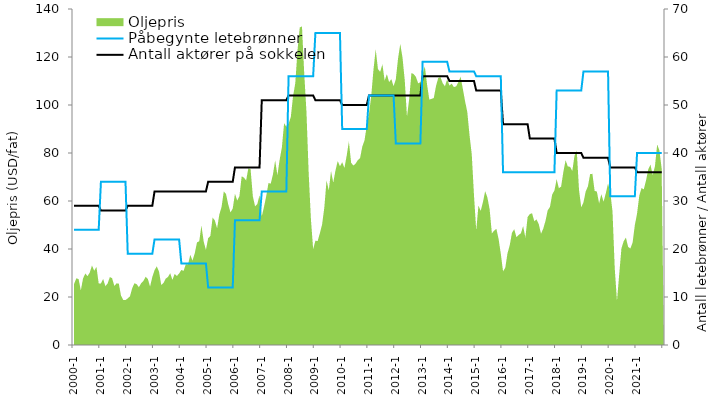
| Category | Antall aktører på sokkelen | Påbegynte letebrønner |
|---|---|---|
| 2000-1 | 29 | 24 |
| 2000-2 | 29 | 24 |
| 2000-3 | 29 | 24 |
| 2000-4 | 29 | 24 |
| 2000-5 | 29 | 24 |
| 2000-6 | 29 | 24 |
| 2000-7 | 29 | 24 |
| 2000-8 | 29 | 24 |
| 2000-9 | 29 | 24 |
| 2000-10 | 29 | 24 |
| 2000-11 | 29 | 24 |
| 2000-12 | 29 | 24 |
| 2001-1 | 28 | 34 |
| 2001-2 | 28 | 34 |
| 2001-3 | 28 | 34 |
| 2001-4 | 28 | 34 |
| 2001-5 | 28 | 34 |
| 2001-6 | 28 | 34 |
| 2001-7 | 28 | 34 |
| 2001-8 | 28 | 34 |
| 2001-9 | 28 | 34 |
| 2001-10 | 28 | 34 |
| 2001-11 | 28 | 34 |
| 2001-12 | 28 | 34 |
| 2002-1 | 29 | 19 |
| 2002-2 | 29 | 19 |
| 2002-3 | 29 | 19 |
| 2002-4 | 29 | 19 |
| 2002-5 | 29 | 19 |
| 2002-6 | 29 | 19 |
| 2002-7 | 29 | 19 |
| 2002-8 | 29 | 19 |
| 2002-9 | 29 | 19 |
| 2002-10 | 29 | 19 |
| 2002-11 | 29 | 19 |
| 2002-12 | 29 | 19 |
| 2003-1 | 32 | 22 |
| 2003-2 | 32 | 22 |
| 2003-3 | 32 | 22 |
| 2003-4 | 32 | 22 |
| 2003-5 | 32 | 22 |
| 2003-6 | 32 | 22 |
| 2003-7 | 32 | 22 |
| 2003-8 | 32 | 22 |
| 2003-9 | 32 | 22 |
| 2003-10 | 32 | 22 |
| 2003-11 | 32 | 22 |
| 2003-12 | 32 | 22 |
| 2004-1 | 32 | 17 |
| 2004-2 | 32 | 17 |
| 2004-3 | 32 | 17 |
| 2004-4 | 32 | 17 |
| 2004-5 | 32 | 17 |
| 2004-6 | 32 | 17 |
| 2004-7 | 32 | 17 |
| 2004-8 | 32 | 17 |
| 2004-9 | 32 | 17 |
| 2004-10 | 32 | 17 |
| 2004-11 | 32 | 17 |
| 2004-12 | 32 | 17 |
| 2005-1 | 34 | 12 |
| 2005-2 | 34 | 12 |
| 2005-3 | 34 | 12 |
| 2005-4 | 34 | 12 |
| 2005-5 | 34 | 12 |
| 2005-6 | 34 | 12 |
| 2005-7 | 34 | 12 |
| 2005-8 | 34 | 12 |
| 2005-9 | 34 | 12 |
| 2005-10 | 34 | 12 |
| 2005-11 | 34 | 12 |
| 2005-12 | 34 | 12 |
| 2006-1 | 37 | 26 |
| 2006-2 | 37 | 26 |
| 2006-3 | 37 | 26 |
| 2006-4 | 37 | 26 |
| 2006-5 | 37 | 26 |
| 2006-6 | 37 | 26 |
| 2006-7 | 37 | 26 |
| 2006-8 | 37 | 26 |
| 2006-9 | 37 | 26 |
| 2006-10 | 37 | 26 |
| 2006-11 | 37 | 26 |
| 2006-12 | 37 | 26 |
| 2007-1 | 51 | 32 |
| 2007-2 | 51 | 32 |
| 2007-3 | 51 | 32 |
| 2007-4 | 51 | 32 |
| 2007-5 | 51 | 32 |
| 2007-6 | 51 | 32 |
| 2007-7 | 51 | 32 |
| 2007-8 | 51 | 32 |
| 2007-9 | 51 | 32 |
| 2007-10 | 51 | 32 |
| 2007-11 | 51 | 32 |
| 2007-12 | 51 | 32 |
| 2008-1 | 52 | 56 |
| 2008-2 | 52 | 56 |
| 2008-3 | 52 | 56 |
| 2008-4 | 52 | 56 |
| 2008-5 | 52 | 56 |
| 2008-6 | 52 | 56 |
| 2008-7 | 52 | 56 |
| 2008-8 | 52 | 56 |
| 2008-9 | 52 | 56 |
| 2008-10 | 52 | 56 |
| 2008-11 | 52 | 56 |
| 2008-12 | 52 | 56 |
| 2009-1 | 51 | 65 |
| 2009-2 | 51 | 65 |
| 2009-3 | 51 | 65 |
| 2009-4 | 51 | 65 |
| 2009-5 | 51 | 65 |
| 2009-6 | 51 | 65 |
| 2009-7 | 51 | 65 |
| 2009-8 | 51 | 65 |
| 2009-9 | 51 | 65 |
| 2009-10 | 51 | 65 |
| 2009-11 | 51 | 65 |
| 2009-12 | 51 | 65 |
| 2010-1 | 50 | 45 |
| 2010-2 | 50 | 45 |
| 2010-3 | 50 | 45 |
| 2010-4 | 50 | 45 |
| 2010-5 | 50 | 45 |
| 2010-6 | 50 | 45 |
| 2010-7 | 50 | 45 |
| 2010-8 | 50 | 45 |
| 2010-9 | 50 | 45 |
| 2010-10 | 50 | 45 |
| 2010-11 | 50 | 45 |
| 2010-12 | 50 | 45 |
| 2011-1 | 52 | 52 |
| 2011-2 | 52 | 52 |
| 2011-3 | 52 | 52 |
| 2011-4 | 52 | 52 |
| 2011-5 | 52 | 52 |
| 2011-6 | 52 | 52 |
| 2011-7 | 52 | 52 |
| 2011-8 | 52 | 52 |
| 2011-9 | 52 | 52 |
| 2011-10 | 52 | 52 |
| 2011-11 | 52 | 52 |
| 2011-12 | 52 | 52 |
| 2012-1 | 52 | 42 |
| 2012-2 | 52 | 42 |
| 2012-3 | 52 | 42 |
| 2012-4 | 52 | 42 |
| 2012-5 | 52 | 42 |
| 2012-6 | 52 | 42 |
| 2012-7 | 52 | 42 |
| 2012-8 | 52 | 42 |
| 2012-9 | 52 | 42 |
| 2012-10 | 52 | 42 |
| 2012-11 | 52 | 42 |
| 2012-12 | 52 | 42 |
| 2013-1 | 56 | 59 |
| 2013-2 | 56 | 59 |
| 2013-3 | 56 | 59 |
| 2013-4 | 56 | 59 |
| 2013-5 | 56 | 59 |
| 2013-6 | 56 | 59 |
| 2013-7 | 56 | 59 |
| 2013-8 | 56 | 59 |
| 2013-9 | 56 | 59 |
| 2013-10 | 56 | 59 |
| 2013-11 | 56 | 59 |
| 2013-12 | 56 | 59 |
| 2014-1 | 55 | 57 |
| 2014-2 | 55 | 57 |
| 2014-3 | 55 | 57 |
| 2014-4 | 55 | 57 |
| 2014-5 | 55 | 57 |
| 2014-6 | 55 | 57 |
| 2014-7 | 55 | 57 |
| 2014-8 | 55 | 57 |
| 2014-9 | 55 | 57 |
| 2014-10 | 55 | 57 |
| 2014-11 | 55 | 57 |
| 2014-12 | 55 | 57 |
| 2015-1 | 53 | 56 |
| 2015-2 | 53 | 56 |
| 2015-3 | 53 | 56 |
| 2015-4 | 53 | 56 |
| 2015-5 | 53 | 56 |
| 2015-6 | 53 | 56 |
| 2015-7 | 53 | 56 |
| 2015-8 | 53 | 56 |
| 2015-9 | 53 | 56 |
| 2015-10 | 53 | 56 |
| 2015-11 | 53 | 56 |
| 2015-12 | 53 | 56 |
| 2016-1 | 46 | 36 |
| 2016-2 | 46 | 36 |
| 2016-3 | 46 | 36 |
| 2016-4 | 46 | 36 |
| 2016-5 | 46 | 36 |
| 2016-6 | 46 | 36 |
| 2016-7 | 46 | 36 |
| 2016-8 | 46 | 36 |
| 2016-9 | 46 | 36 |
| 2016-10 | 46 | 36 |
| 2016-11 | 46 | 36 |
| 2016-12 | 46 | 36 |
| 2017-1 | 43 | 36 |
| 2017-2 | 43 | 36 |
| 2017-3 | 43 | 36 |
| 2017-4 | 43 | 36 |
| 2017-5 | 43 | 36 |
| 2017-6 | 43 | 36 |
| 2017-7 | 43 | 36 |
| 2017-8 | 43 | 36 |
| 2017-9 | 43 | 36 |
| 2017-10 | 43 | 36 |
| 2017-11 | 43 | 36 |
| 2017-12 | 43 | 36 |
| 2018-1 | 40 | 53 |
| 2018-2 | 40 | 53 |
| 2018-3 | 40 | 53 |
| 2018-4 | 40 | 53 |
| 2018-5 | 40 | 53 |
| 2018-6 | 40 | 53 |
| 2018-7 | 40 | 53 |
| 2018-8 | 40 | 53 |
| 2018-9 | 40 | 53 |
| 2018-10 | 40 | 53 |
| 2018-11 | 40 | 53 |
| 2018-12 | 40 | 53 |
| 2019-1 | 39 | 57 |
| 2019-2 | 39 | 57 |
| 2019-3 | 39 | 57 |
| 2019-4 | 39 | 57 |
| 2019-5 | 39 | 57 |
| 2019-6 | 39 | 57 |
| 2019-7 | 39 | 57 |
| 2019-8 | 39 | 57 |
| 2019-9 | 39 | 57 |
| 2019-10 | 39 | 57 |
| 2019-11 | 39 | 57 |
| 2019-12 | 39 | 57 |
| 2020-1 | 37 | 31 |
| 2020-2 | 37 | 31 |
| 2020-3 | 37 | 31 |
| 2020-4 | 37 | 31 |
| 2020-5 | 37 | 31 |
| 2020-6 | 37 | 31 |
| 2020-7 | 37 | 31 |
| 2020-8 | 37 | 31 |
| 2020-9 | 37 | 31 |
| 2020-10 | 37 | 31 |
| 2020-11 | 37 | 31 |
| 2020-12 | 37 | 31 |
| 2021-1 | 36 | 40 |
| 2021-2 | 36 | 40 |
| 2021-3 | 36 | 40 |
| 2021-4 | 36 | 40 |
| 2021-5 | 36 | 40 |
| 2021-6 | 36 | 40 |
| 2021-7 | 36 | 40 |
| 2021-8 | 36 | 40 |
| 2021-9 | 36 | 40 |
| 2021-10 | 36 | 40 |
| 2021-11 | 36 | 40 |
| 2021-12 | 36 | 40 |